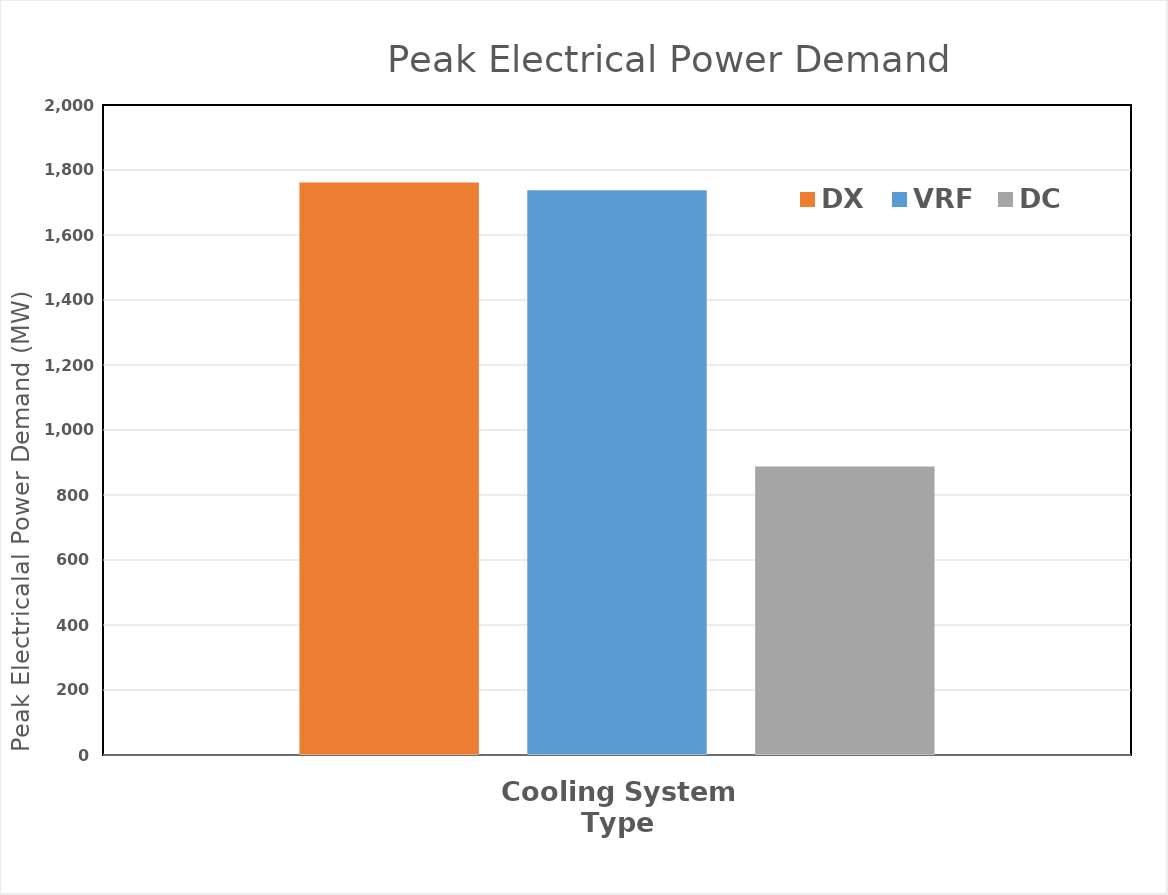
| Category | DX | VRF | DC |
|---|---|---|---|
| 0 | 1761.6 | 1737.6 | 888 |